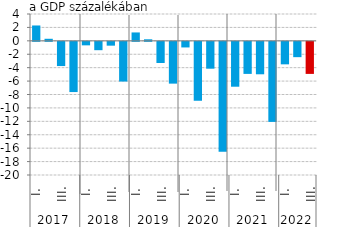
| Category | Series 0 |
|---|---|
| 0 | 2.289 |
| 1 | 0.306 |
| 2 | -3.611 |
| 3 | -7.487 |
| 4 | -0.523 |
| 5 | -1.246 |
| 6 | -0.57 |
| 7 | -5.92 |
| 8 | 1.251 |
| 9 | 0.229 |
| 10 | -3.153 |
| 11 | -6.231 |
| 12 | -0.836 |
| 13 | -8.784 |
| 14 | -4.002 |
| 15 | -16.387 |
| 16 | -6.69 |
| 17 | -4.78 |
| 18 | -4.838 |
| 19 | -11.936 |
| 20 | -3.355 |
| 21 | -2.285 |
| 22 | -4.781 |